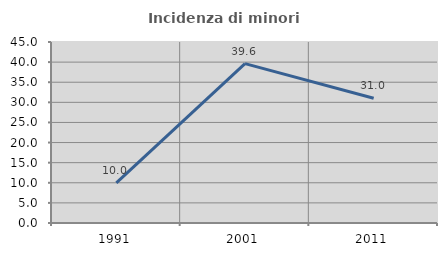
| Category | Incidenza di minori stranieri |
|---|---|
| 1991.0 | 10 |
| 2001.0 | 39.623 |
| 2011.0 | 31 |